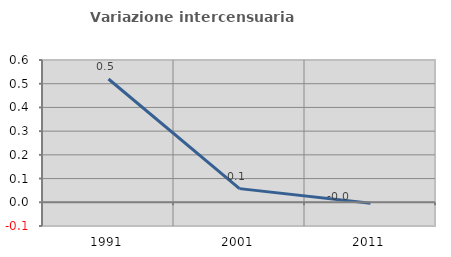
| Category | Variazione intercensuaria annua |
|---|---|
| 1991.0 | 0.52 |
| 2001.0 | 0.058 |
| 2011.0 | -0.004 |